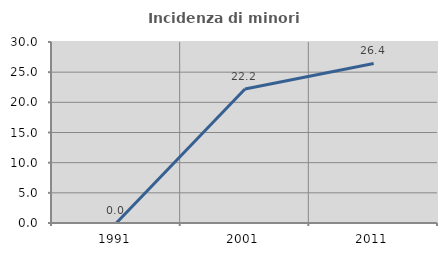
| Category | Incidenza di minori stranieri |
|---|---|
| 1991.0 | 0 |
| 2001.0 | 22.222 |
| 2011.0 | 26.449 |